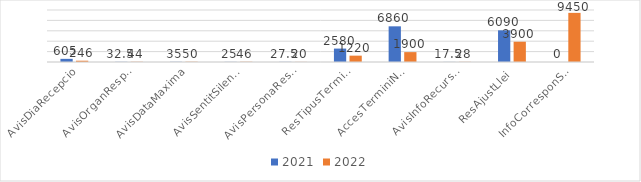
| Category | 2021 | 2022 |
|---|---|---|
| AvisDiaRecepcio | 605 | 246 |
| AvisOrganResponsable | 32.5 | 44 |
| AvisDataMaxima | 35 | 50 |
| AvisSentitSilenci | 25 | 46 |
| AvisPersonaResponsable | 27.5 | 20 |
| ResTipusTermini | 2580 | 1220 |
| AccesTerminiNormativa | 6860 | 1900 |
| AvisInfoRecursos | 17.5 | 28 |
| ResAjustLlei | 6090 | 3900 |
| InfoCorresponSolicitud | 0 | 9450 |